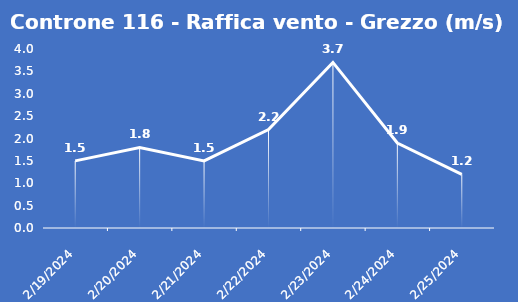
| Category | Controne 116 - Raffica vento - Grezzo (m/s) |
|---|---|
| 2/19/24 | 1.5 |
| 2/20/24 | 1.8 |
| 2/21/24 | 1.5 |
| 2/22/24 | 2.2 |
| 2/23/24 | 3.7 |
| 2/24/24 | 1.9 |
| 2/25/24 | 1.2 |